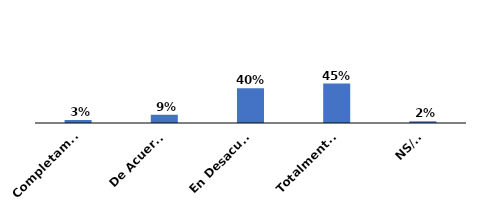
| Category | Series 0 |
|---|---|
| Completamente de acuerdo | 0.035 |
| De Acuerdo | 0.095 |
| En Desacuerdo | 0.398 |
| Totalmente en desacuerdo | 0.453 |
| NS/NR | 0.02 |